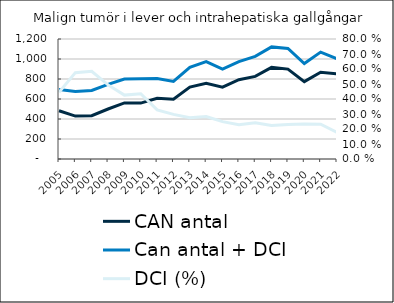
| Category |  CAN antal  |  Can antal + DCI  |
|---|---|---|
| 2005.0 | 482 | 696 |
| 2006.0 | 429 | 676 |
| 2007.0 | 433 | 686 |
| 2008.0 | 500 | 747 |
| 2009.0 | 561 | 800 |
| 2010.0 | 559 | 802 |
| 2011.0 | 607 | 806 |
| 2012.0 | 598 | 776 |
| 2013.0 | 719 | 917 |
| 2014.0 | 758 | 973 |
| 2015.0 | 719 | 898 |
| 2016.0 | 793 | 974 |
| 2017.0 | 826 | 1026 |
| 2018.0 | 916 | 1121 |
| 2019.0 | 899 | 1106 |
| 2020.0 | 774 | 955 |
| 2021.0 | 868 | 1069 |
| 2022.0 | 852 | 1003 |